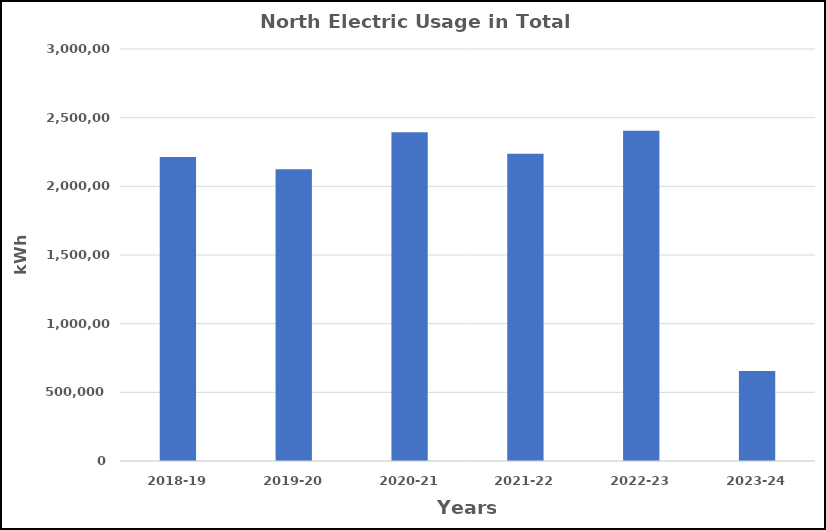
| Category | Series 0 |
|---|---|
| 2018-19 | 2213291 |
| 2019-20 | 2123597 |
| 2020-21 | 2393790 |
| 2021-22 | 2238009 |
| 2022-23 | 2405003 |
| 2023-24 | 655499 |